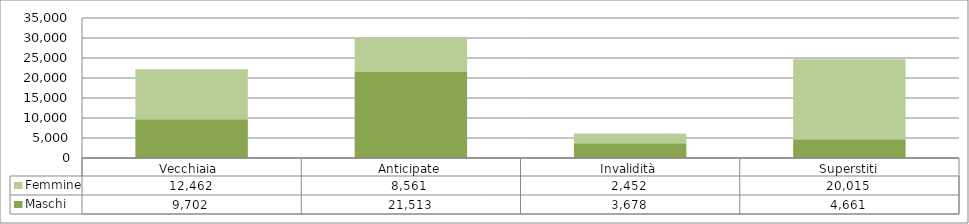
| Category | Maschi | Femmine |
|---|---|---|
| Vecchiaia  | 9702 | 12462 |
| Anticipate | 21513 | 8561 |
| Invalidità | 3678 | 2452 |
| Superstiti | 4661 | 20015 |